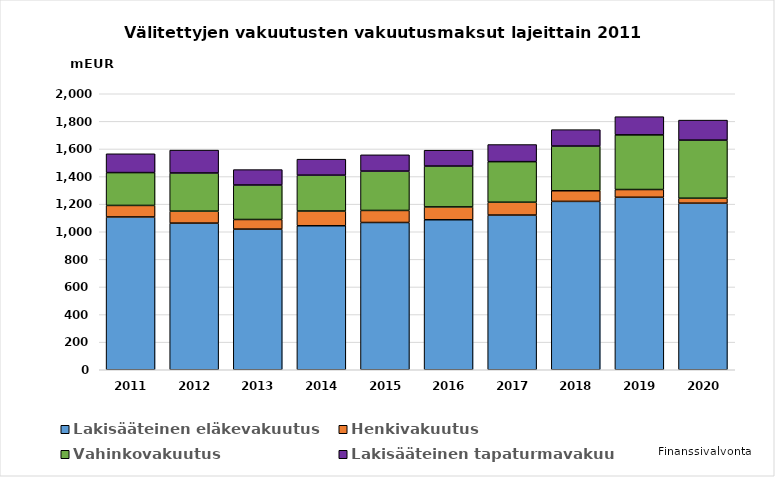
| Category | Lakisääteinen eläkevakuutus | Henkivakuutus | Vahinkovakuutus | Lakisääteinen tapaturmavakuutus |
|---|---|---|---|---|
| 2011.0 | 1107.329 | 83.403 | 238.041 | 136.289 |
| 2012.0 | 1062.705 | 86.597 | 276.62 | 165.706 |
| 2013.0 | 1019.216 | 69.648 | 249.823 | 111.515 |
| 2014.0 | 1043.573 | 106.619 | 259.835 | 115.957 |
| 2015.0 | 1067.062 | 87.285 | 284.943 | 118.153 |
| 2016.0 | 1087 | 93 | 296 | 115 |
| 2017.0 | 1121 | 93 | 294 | 124 |
| 2018.0 | 1220 | 77 | 324 | 119 |
| 2019.0 | 1250 | 56 | 396 | 132 |
| 2020.0 | 1207 | 36 | 421 | 145 |